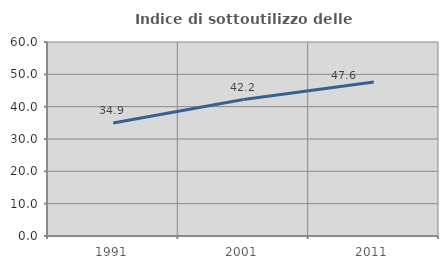
| Category | Indice di sottoutilizzo delle abitazioni  |
|---|---|
| 1991.0 | 34.94 |
| 2001.0 | 42.189 |
| 2011.0 | 47.623 |